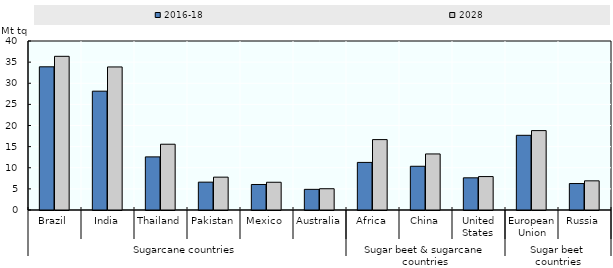
| Category | 2016-18 | 2028 |
|---|---|---|
| 0 | 33.891 | 36.373 |
| 1 | 28.123 | 33.86 |
| 2 | 12.57 | 15.567 |
| 3 | 6.592 | 7.775 |
| 4 | 6.038 | 6.565 |
| 5 | 4.887 | 5.034 |
| 6 | 11.265 | 16.664 |
| 7 | 10.351 | 13.269 |
| 8 | 7.617 | 7.911 |
| 9 | 17.681 | 18.791 |
| 10 | 6.262 | 6.902 |